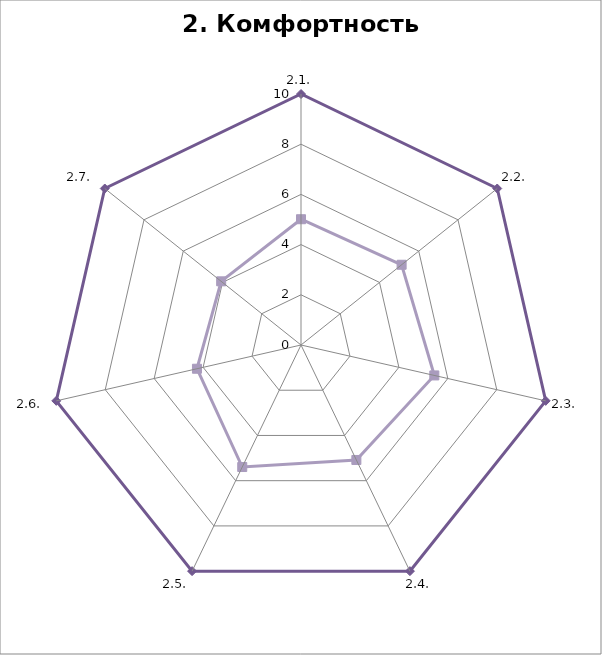
| Category | Series 0 | Series 1 |
|---|---|---|
| 2.1. | 10 | 5.011 |
| 2.2.  | 10 | 5.127 |
| 2.3.  | 10 | 5.448 |
| 2.4.  | 10 | 5.084 |
| 2.5.  | 10 | 5.396 |
| 2.6.  | 10 | 4.251 |
| 2.7.  | 10 | 4.068 |